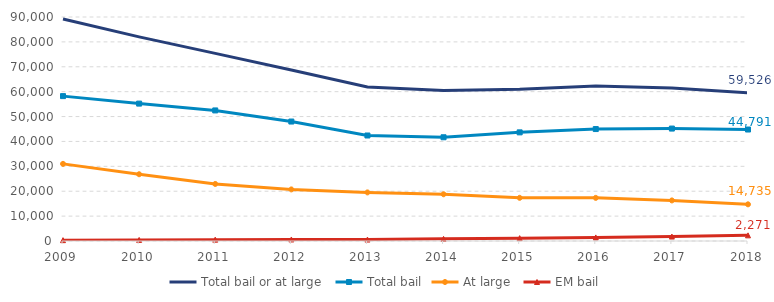
| Category | Total bail or at large | Total bail | At large | EM bail |
|---|---|---|---|---|
| 2009.0 | 89199 | 58210 | 30989 | 344 |
| 2010.0 | 82029 | 55204 | 26825 | 435 |
| 2011.0 | 75385 | 52461 | 22924 | 537 |
| 2012.0 | 68723 | 47995 | 20728 | 613 |
| 2013.0 | 61913 | 42390 | 19523 | 577 |
| 2014.0 | 60457 | 41678 | 18779 | 855 |
| 2015.0 | 60997 | 43649 | 17348 | 1143 |
| 2016.0 | 62308 | 44975 | 17333 | 1436 |
| 2017.0 | 61473 | 45170 | 16303 | 1783 |
| 2018.0 | 59526 | 44791 | 14735 | 2271 |